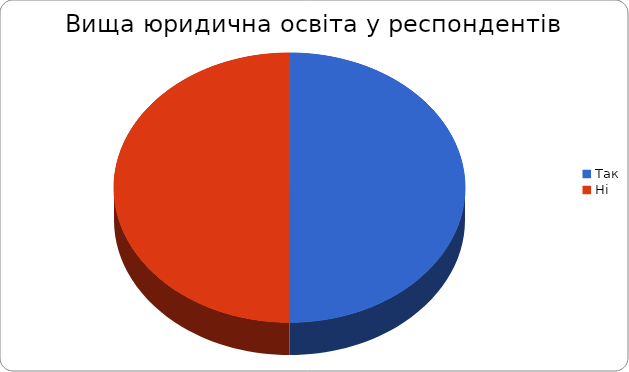
| Category | Series 0 |
|---|---|
| Так | 25 |
| Ні | 25 |